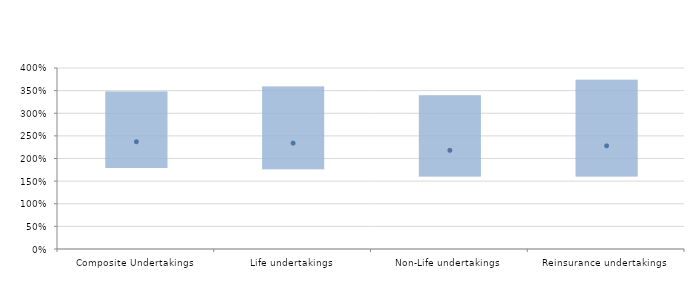
| Category | 25% | 50% | 75% |
|---|---|---|---|
| Composite Undertakings | 1.79 | 2.37 | 3.48 |
| Life undertakings | 1.76 | 2.34 | 3.59 |
| Non-Life undertakings | 1.6 | 2.18 | 3.4 |
| Reinsurance undertakings | 1.6 | 2.28 | 3.74 |